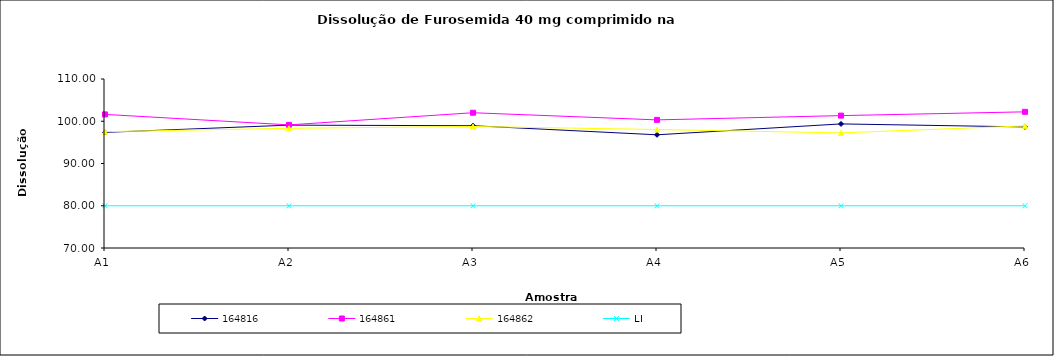
| Category | 164816 | 164861 | 164862 | LI |
|---|---|---|---|---|
| A1 | 97.363 | 101.62 | 97.537 | 80 |
| A2 | 99.08 | 99.14 | 98.333 | 80 |
| A3 | 98.94 | 102.013 | 98.763 | 80 |
| A4 | 96.79 | 100.323 | 98.043 | 80 |
| A5 | 99.37 | 101.333 | 97.247 | 80 |
| A6 | 98.657 | 102.23 | 98.907 | 80 |